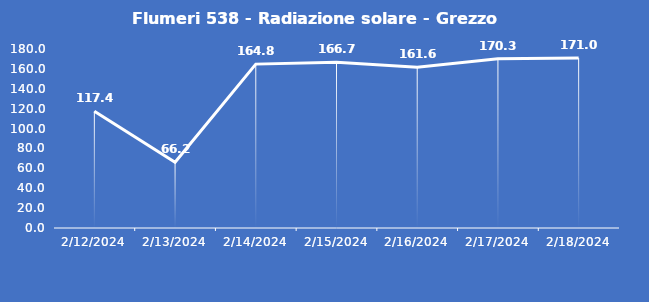
| Category | Flumeri 538 - Radiazione solare - Grezzo (W/m2) |
|---|---|
| 2/12/24 | 117.4 |
| 2/13/24 | 66.2 |
| 2/14/24 | 164.8 |
| 2/15/24 | 166.7 |
| 2/16/24 | 161.6 |
| 2/17/24 | 170.3 |
| 2/18/24 | 171 |